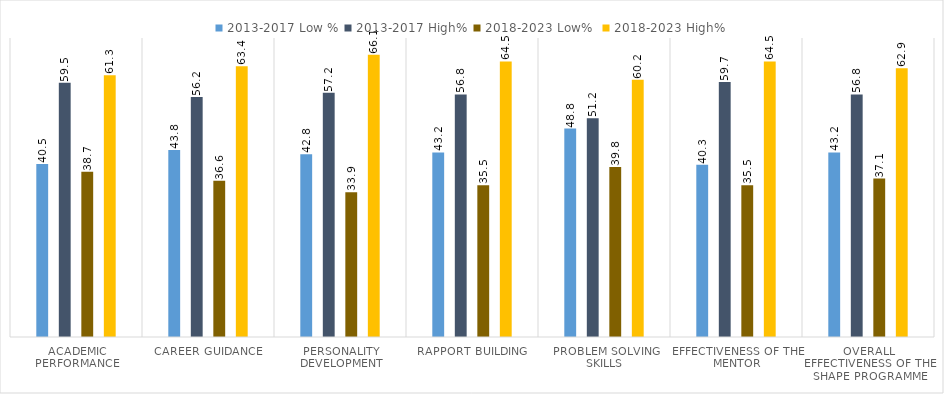
| Category | 2013-2017 | 2018-2023 |
|---|---|---|
| Academic Performance | 59.5 | 61.3 |
| Career Guidance | 56.2 | 63.4 |
| Personality Development | 57.2 | 66.1 |
| Rapport Building | 56.8 | 64.5 |
| Problem Solving Skills | 51.2 | 60.2 |
| Effectiveness of the Mentor | 59.7 | 64.5 |
| Overall Effectiveness of the SHAPE Programme | 56.8 | 62.9 |